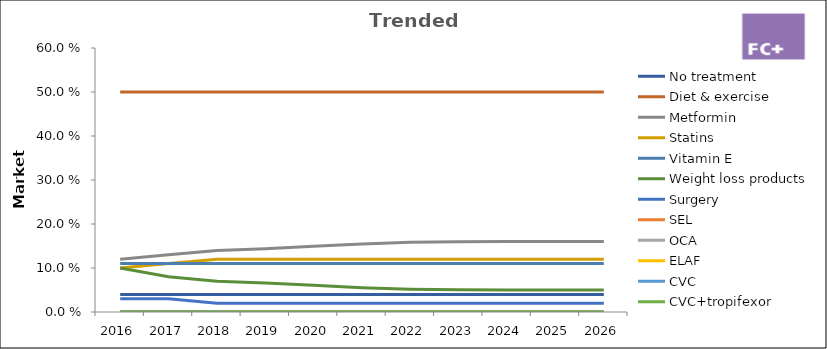
| Category | No treatment | Diet & exercise | Metformin | Statins | Vitamin E | Weight loss products | Surgery | SEL | OCA | ELAF | CVC | CVC+tropifexor |
|---|---|---|---|---|---|---|---|---|---|---|---|---|
| 2016.0 | 0.04 | 0.5 | 0.12 | 0.1 | 0.11 | 0.1 | 0.03 | 0 | 0 | 0 | 0 | 0 |
| 2017.0 | 0.04 | 0.5 | 0.13 | 0.11 | 0.11 | 0.08 | 0.03 | 0 | 0 | 0 | 0 | 0 |
| 2018.0 | 0.04 | 0.5 | 0.14 | 0.12 | 0.11 | 0.07 | 0.02 | 0 | 0 | 0 | 0 | 0 |
| 2019.0 | 0.04 | 0.5 | 0.144 | 0.12 | 0.11 | 0.066 | 0.02 | 0 | 0 | 0 | 0 | 0 |
| 2020.0 | 0.04 | 0.5 | 0.149 | 0.12 | 0.11 | 0.061 | 0.02 | 0 | 0 | 0 | 0 | 0 |
| 2021.0 | 0.04 | 0.5 | 0.155 | 0.12 | 0.11 | 0.055 | 0.02 | 0 | 0 | 0 | 0 | 0 |
| 2022.0 | 0.04 | 0.5 | 0.158 | 0.12 | 0.11 | 0.052 | 0.02 | 0 | 0 | 0 | 0 | 0 |
| 2023.0 | 0.04 | 0.5 | 0.16 | 0.12 | 0.11 | 0.05 | 0.02 | 0 | 0 | 0 | 0 | 0 |
| 2024.0 | 0.04 | 0.5 | 0.16 | 0.12 | 0.11 | 0.05 | 0.02 | 0 | 0 | 0 | 0 | 0 |
| 2025.0 | 0.04 | 0.5 | 0.16 | 0.12 | 0.11 | 0.05 | 0.02 | 0 | 0 | 0 | 0 | 0 |
| 2026.0 | 0.04 | 0.5 | 0.16 | 0.12 | 0.11 | 0.05 | 0.02 | 0 | 0 | 0 | 0 | 0 |